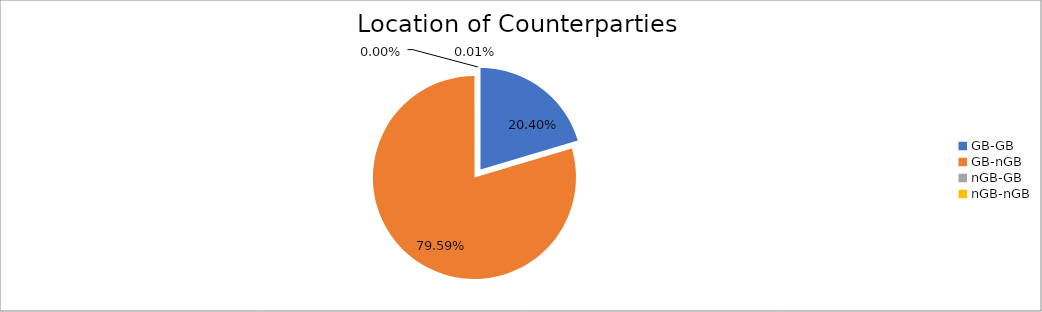
| Category | Series 0 |
|---|---|
| GB-GB | 1916498.478 |
| GB-nGB | 7476366.803 |
| nGB-GB | 300.105 |
| nGB-nGB | 747.814 |